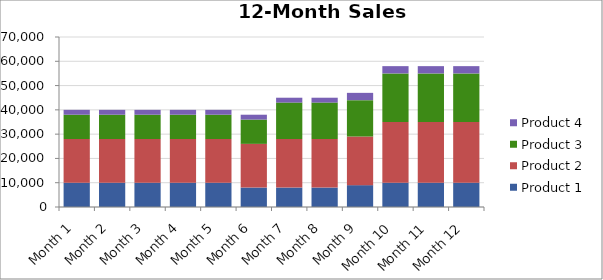
| Category | Product 1 | Product 2 | Product 3 | Product 4 |
|---|---|---|---|---|
| Month 1 | 10000 | 18000 | 10000 | 2000 |
| Month 2 | 10000 | 18000 | 10000 | 2000 |
| Month 3 | 10000 | 18000 | 10000 | 2000 |
| Month 4 | 10000 | 18000 | 10000 | 2000 |
| Month 5 | 10000 | 18000 | 10000 | 2000 |
| Month 6 | 8000 | 18000 | 10000 | 2000 |
| Month 7 | 8000 | 20000 | 15000 | 2000 |
| Month 8 | 8000 | 20000 | 15000 | 2000 |
| Month 9 | 9000 | 20000 | 15000 | 3000 |
| Month 10 | 10000 | 25000 | 20000 | 3000 |
| Month 11 | 10000 | 25000 | 20000 | 3000 |
| Month 12 | 10000 | 25000 | 20000 | 3000 |